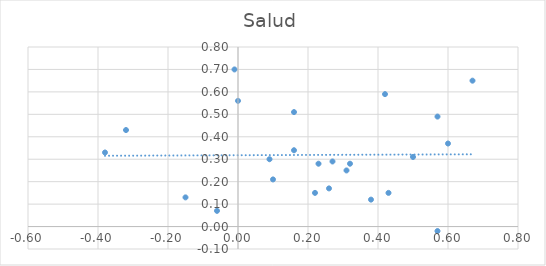
| Category | Salud |
|---|---|
| 0.38 | 0.12 |
| -0.15 | 0.13 |
| -0.06 | 0.07 |
| 0.32 | 0.28 |
| -0.01 | 0.7 |
| 0.0 | 0.56 |
| -0.38 | 0.33 |
| -0.32 | 0.43 |
| 0.16 | 0.51 |
| 0.57 | 0.49 |
| 0.67 | 0.65 |
| 0.42 | 0.59 |
| 0.26 | 0.17 |
| 0.1 | 0.21 |
| 0.16 | 0.34 |
| 0.23 | 0.28 |
| 0.09 | 0.3 |
| 0.22 | 0.15 |
| 0.27 | 0.29 |
| 0.31 | 0.25 |
| 0.5 | 0.31 |
| 0.43 | 0.15 |
| 0.57 | -0.02 |
| 0.6 | 0.37 |